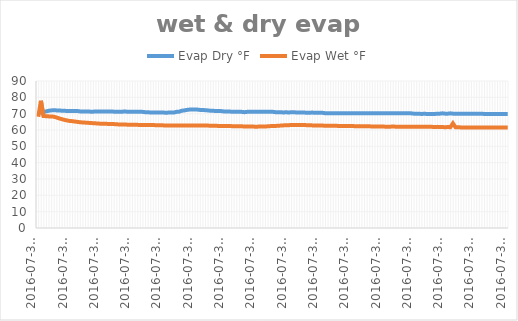
| Category | Evap Dry °F | Evap Wet °F |
|---|---|---|
| 2016-07-31 21:50:39 | 70.7 | 68.112 |
| 2016-07-31 21:50:49 | 70.7 | 77.9 |
| 2016-07-31 21:50:59 | 71.1 | 68.562 |
| 2016-07-31 21:51:09 | 71.4 | 68.45 |
| 2016-07-31 21:51:19 | 71.8 | 68.338 |
| 2016-07-31 21:51:29 | 72 | 68.338 |
| 2016-07-31 21:51:39 | 72.1 | 68.113 |
| 2016-07-31 21:51:49 | 72 | 67.662 |
| 2016-07-31 21:51:59 | 72 | 67.1 |
| 2016-07-31 21:52:09 | 71.8 | 66.65 |
| 2016-07-31 21:52:19 | 71.8 | 66.2 |
| 2016-07-31 21:52:29 | 71.6 | 65.863 |
| 2016-07-31 21:52:39 | 71.6 | 65.525 |
| 2016-07-31 21:52:49 | 71.6 | 65.412 |
| 2016-07-31 21:52:59 | 71.6 | 65.188 |
| 2016-07-31 21:53:09 | 71.6 | 64.963 |
| 2016-07-31 21:53:19 | 71.4 | 64.738 |
| 2016-07-31 21:53:29 | 71.4 | 64.625 |
| 2016-07-31 21:53:39 | 71.4 | 64.512 |
| 2016-07-31 21:53:49 | 71.4 | 64.4 |
| 2016-07-31 21:53:59 | 71.2 | 64.287 |
| 2016-07-31 21:54:09 | 71.2 | 64.175 |
| 2016-07-31 21:54:19 | 71.4 | 64.062 |
| 2016-07-31 21:54:29 | 71.4 | 63.95 |
| 2016-07-31 21:54:39 | 71.4 | 63.838 |
| 2016-07-31 21:54:49 | 71.4 | 63.838 |
| 2016-07-31 21:54:59 | 71.4 | 63.838 |
| 2016-07-31 21:55:09 | 71.4 | 63.612 |
| 2016-07-31 21:55:19 | 71.4 | 63.725 |
| 2016-07-31 21:55:29 | 71.2 | 63.612 |
| 2016-07-31 21:55:39 | 71.2 | 63.5 |
| 2016-07-31 21:55:49 | 71.2 | 63.388 |
| 2016-07-31 21:55:59 | 71.1 | 63.388 |
| 2016-07-31 21:56:09 | 71.4 | 63.388 |
| 2016-07-31 21:56:19 | 71.2 | 63.275 |
| 2016-07-31 21:56:29 | 71.2 | 63.275 |
| 2016-07-31 21:56:39 | 71.2 | 63.162 |
| 2016-07-31 21:56:49 | 71.1 | 63.162 |
| 2016-07-31 21:56:59 | 71.1 | 63.162 |
| 2016-07-31 21:57:09 | 71.1 | 63.05 |
| 2016-07-31 21:57:19 | 71.1 | 63.05 |
| 2016-07-31 21:57:29 | 70.9 | 63.05 |
| 2016-07-31 21:57:39 | 70.9 | 63.05 |
| 2016-07-31 21:57:49 | 70.7 | 63.05 |
| 2016-07-31 21:57:59 | 70.7 | 63.05 |
| 2016-07-31 21:58:09 | 70.7 | 62.938 |
| 2016-07-31 21:58:19 | 70.7 | 62.938 |
| 2016-07-31 21:58:29 | 70.7 | 62.938 |
| 2016-07-31 21:58:39 | 70.7 | 62.825 |
| 2016-07-31 21:58:49 | 70.5 | 62.825 |
| 2016-07-31 21:58:59 | 70.7 | 62.825 |
| 2016-07-31 21:59:09 | 70.7 | 62.825 |
| 2016-07-31 21:59:19 | 70.7 | 62.825 |
| 2016-07-31 21:59:29 | 71.1 | 62.825 |
| 2016-07-31 21:59:39 | 71.2 | 62.713 |
| 2016-07-31 21:59:49 | 71.8 | 62.713 |
| 2016-07-31 21:59:59 | 72 | 62.713 |
| 2016-07-31 22:00:09 | 72.3 | 62.825 |
| 2016-07-31 22:00:19 | 72.5 | 62.825 |
| 2016-07-31 22:00:29 | 72.5 | 62.825 |
| 2016-07-31 22:00:39 | 72.5 | 62.713 |
| 2016-07-31 22:00:49 | 72.5 | 62.825 |
| 2016-07-31 22:00:59 | 72.3 | 62.713 |
| 2016-07-31 22:01:09 | 72.3 | 62.713 |
| 2016-07-31 22:01:19 | 72.1 | 62.713 |
| 2016-07-31 22:01:29 | 72 | 62.713 |
| 2016-07-31 22:01:39 | 71.8 | 62.6 |
| 2016-07-31 22:01:49 | 71.8 | 62.6 |
| 2016-07-31 22:01:59 | 71.6 | 62.6 |
| 2016-07-31 22:02:09 | 71.6 | 62.488 |
| 2016-07-31 22:02:19 | 71.6 | 62.488 |
| 2016-07-31 22:02:29 | 71.4 | 62.488 |
| 2016-07-31 22:02:39 | 71.4 | 62.375 |
| 2016-07-31 22:02:49 | 71.4 | 62.375 |
| 2016-07-31 22:02:59 | 71.2 | 62.375 |
| 2016-07-31 22:03:09 | 71.2 | 62.262 |
| 2016-07-31 22:03:19 | 71.2 | 62.262 |
| 2016-07-31 22:03:29 | 71.1 | 62.262 |
| 2016-07-31 22:03:39 | 71.1 | 62.262 |
| 2016-07-31 22:03:49 | 70.9 | 62.15 |
| 2016-07-31 22:03:59 | 71.1 | 62.15 |
| 2016-07-31 22:04:09 | 71.1 | 62.15 |
| 2016-07-31 22:04:19 | 71.1 | 62.15 |
| 2016-07-31 22:04:29 | 71.1 | 62.038 |
| 2016-07-31 22:04:39 | 71.1 | 62.038 |
| 2016-07-31 22:04:49 | 71.1 | 62.15 |
| 2016-07-31 22:04:59 | 71.1 | 62.15 |
| 2016-07-31 22:05:09 | 71.1 | 62.15 |
| 2016-07-31 22:05:19 | 71.1 | 62.262 |
| 2016-07-31 22:05:29 | 71.1 | 62.375 |
| 2016-07-31 22:05:39 | 71.1 | 62.375 |
| 2016-07-31 22:05:49 | 70.9 | 62.488 |
| 2016-07-31 22:05:59 | 70.9 | 62.6 |
| 2016-07-31 22:06:09 | 70.9 | 62.713 |
| 2016-07-31 22:06:19 | 70.7 | 62.825 |
| 2016-07-31 22:06:29 | 70.9 | 62.938 |
| 2016-07-31 22:06:39 | 70.7 | 62.938 |
| 2016-07-31 22:06:49 | 70.9 | 63.05 |
| 2016-07-31 22:06:59 | 70.9 | 63.05 |
| 2016-07-31 22:07:09 | 70.7 | 63.05 |
| 2016-07-31 22:07:19 | 70.7 | 63.05 |
| 2016-07-31 22:07:29 | 70.7 | 63.05 |
| 2016-07-31 22:07:39 | 70.7 | 63.05 |
| 2016-07-31 22:07:49 | 70.5 | 62.938 |
| 2016-07-31 22:07:59 | 70.5 | 62.938 |
| 2016-07-31 22:08:09 | 70.7 | 62.825 |
| 2016-07-31 22:08:19 | 70.5 | 62.825 |
| 2016-07-31 22:08:29 | 70.5 | 62.825 |
| 2016-07-31 22:08:39 | 70.5 | 62.713 |
| 2016-07-31 22:08:49 | 70.5 | 62.713 |
| 2016-07-31 22:08:59 | 70.3 | 62.6 |
| 2016-07-31 22:09:09 | 70.3 | 62.6 |
| 2016-07-31 22:09:19 | 70.3 | 62.6 |
| 2016-07-31 22:09:29 | 70.3 | 62.6 |
| 2016-07-31 22:09:39 | 70.3 | 62.6 |
| 2016-07-31 22:09:49 | 70.2 | 62.488 |
| 2016-07-31 22:09:59 | 70.2 | 62.488 |
| 2016-07-31 22:10:09 | 70.2 | 62.488 |
| 2016-07-31 22:10:19 | 70.2 | 62.488 |
| 2016-07-31 22:10:29 | 70.2 | 62.375 |
| 2016-07-31 22:10:39 | 70.3 | 62.375 |
| 2016-07-31 22:10:49 | 70.3 | 62.375 |
| 2016-07-31 22:10:59 | 70.3 | 62.262 |
| 2016-07-31 22:11:09 | 70.3 | 62.375 |
| 2016-07-31 22:11:19 | 70.3 | 62.262 |
| 2016-07-31 22:11:29 | 70.3 | 62.262 |
| 2016-07-31 22:11:39 | 70.3 | 62.262 |
| 2016-07-31 22:11:49 | 70.3 | 62.262 |
| 2016-07-31 22:11:59 | 70.3 | 62.15 |
| 2016-07-31 22:12:09 | 70.2 | 62.15 |
| 2016-07-31 22:12:19 | 70.3 | 62.15 |
| 2016-07-31 22:12:29 | 70.3 | 62.15 |
| 2016-07-31 22:12:39 | 70.3 | 62.15 |
| 2016-07-31 22:12:49 | 70.3 | 62.038 |
| 2016-07-31 22:12:59 | 70.3 | 62.038 |
| 2016-07-31 22:13:09 | 70.3 | 62.038 |
| 2016-07-31 22:13:19 | 70.3 | 62.15 |
| 2016-07-31 22:13:29 | 70.3 | 62.038 |
| 2016-07-31 22:13:39 | 70.2 | 62.038 |
| 2016-07-31 22:13:49 | 70.2 | 62.038 |
| 2016-07-31 22:13:59 | 70.2 | 62.038 |
| 2016-07-31 22:14:09 | 70.2 | 62.038 |
| 2016-07-31 22:14:19 | 70.2 | 62.038 |
| 2016-07-31 22:14:29 | 70.2 | 62.038 |
| 2016-07-31 22:14:39 | 70 | 62.038 |
| 2016-07-31 22:14:49 | 70 | 62.038 |
| 2016-07-31 22:14:59 | 70 | 62.038 |
| 2016-07-31 22:15:09 | 69.8 | 62.038 |
| 2016-07-31 22:15:19 | 70 | 61.925 |
| 2016-07-31 22:15:29 | 69.8 | 61.925 |
| 2016-07-31 22:15:39 | 69.8 | 61.925 |
| 2016-07-31 22:15:49 | 69.8 | 61.925 |
| 2016-07-31 22:15:59 | 69.8 | 61.812 |
| 2016-07-31 22:16:09 | 70 | 61.925 |
| 2016-07-31 22:16:19 | 70 | 61.812 |
| 2016-07-31 22:16:29 | 70.2 | 61.812 |
| 2016-07-31 22:16:39 | 70 | 61.7 |
| 2016-07-31 22:16:49 | 70 | 61.812 |
| 2016-07-31 22:16:59 | 70.2 | 61.7 |
| 2016-07-31 22:17:09 | 70 | 64.062 |
| 2016-07-31 22:17:19 | 70 | 61.7 |
| 2016-07-31 22:17:29 | 70 | 61.7 |
| 2016-07-31 22:17:39 | 70 | 61.588 |
| 2016-07-31 22:17:49 | 70 | 61.588 |
| 2016-07-31 22:17:59 | 70 | 61.588 |
| 2016-07-31 22:18:09 | 70 | 61.588 |
| 2016-07-31 22:18:19 | 70 | 61.588 |
| 2016-07-31 22:18:29 | 70 | 61.588 |
| 2016-07-31 22:18:39 | 70 | 61.588 |
| 2016-07-31 22:18:49 | 70 | 61.588 |
| 2016-07-31 22:18:59 | 70 | 61.588 |
| 2016-07-31 22:19:09 | 69.8 | 61.588 |
| 2016-07-31 22:19:19 | 69.8 | 61.588 |
| 2016-07-31 22:19:29 | 69.8 | 61.588 |
| 2016-07-31 22:19:39 | 69.8 | 61.588 |
| 2016-07-31 22:19:49 | 69.8 | 61.588 |
| 2016-07-31 22:19:59 | 69.8 | 61.588 |
| 2016-07-31 22:20:09 | 69.8 | 61.475 |
| 2016-07-31 22:20:19 | 69.8 | 61.475 |
| 2016-07-31 22:20:29 | 69.8 | 61.475 |
| 2016-07-31 22:20:39 | 69.8 | 61.475 |